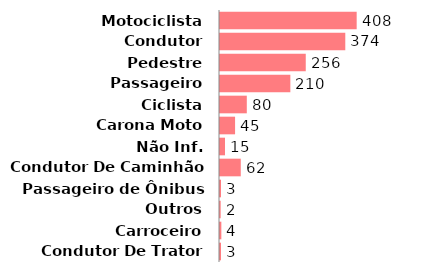
| Category | Qtde |
|---|---|
| Motociclista | 408 |
| Condutor | 374 |
| Pedestre | 256 |
| Passageiro | 210 |
| Ciclista | 80 |
| Carona Moto | 45 |
| Não Inf. | 15 |
| Condutor De Caminhão | 62 |
| Passageiro de Ônibus | 3 |
| Outros | 2 |
| Carroceiro | 4 |
| Condutor De Trator | 3 |